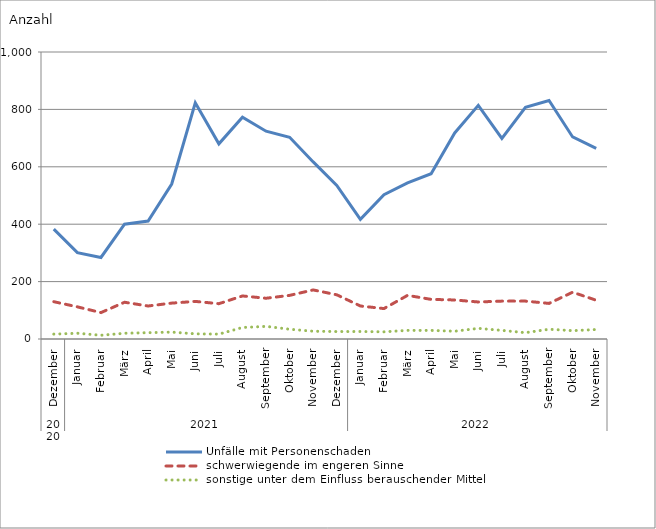
| Category | Unfälle mit Personenschaden | schwerwiegende im engeren Sinne | sonstige unter dem Einfluss berauschender Mittel |
|---|---|---|---|
| 0 | 383 | 130 | 17 |
| 1 | 301 | 112 | 20 |
| 2 | 284 | 92 | 13 |
| 3 | 400 | 128 | 20 |
| 4 | 411 | 115 | 22 |
| 5 | 540 | 125 | 24 |
| 6 | 823 | 131 | 18 |
| 7 | 680 | 123 | 17 |
| 8 | 773 | 150 | 40 |
| 9 | 724 | 142 | 44 |
| 10 | 703 | 152 | 34 |
| 11 | 617 | 171 | 27 |
| 12 | 535 | 154 | 26 |
| 13 | 417 | 115 | 26 |
| 14 | 503 | 106 | 25 |
| 15 | 544 | 152 | 30 |
| 16 | 576 | 138 | 30 |
| 17 | 718 | 136 | 27 |
| 18 | 814 | 129 | 37 |
| 19 | 699 | 132 | 30 |
| 20 | 807 | 132 | 22 |
| 21 | 831 | 124 | 34 |
| 22 | 704 | 163 | 29 |
| 23 | 664 | 135 | 33 |